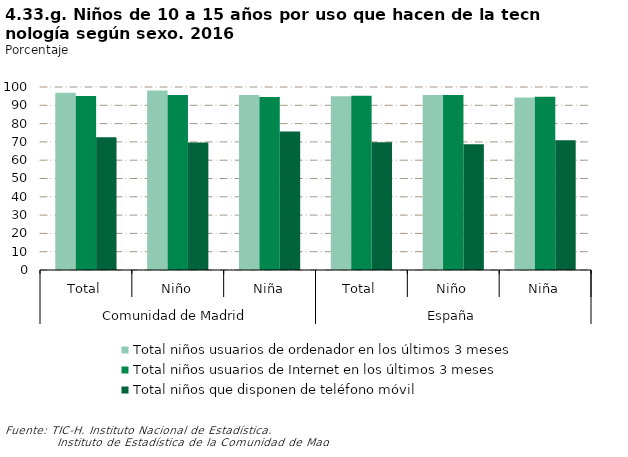
| Category | Total niños usuarios de ordenador en los últimos 3 meses | Total niños usuarios de Internet en los últimos 3 meses | Total niños que disponen de teléfono móvil |
|---|---|---|---|
| 0 | 96.852 | 95.101 | 72.58 |
| 1 | 98.081 | 95.591 | 69.668 |
| 2 | 95.56 | 94.586 | 75.643 |
| 3 | 94.934 | 95.207 | 69.803 |
| 4 | 95.601 | 95.67 | 68.756 |
| 5 | 94.227 | 94.717 | 70.913 |